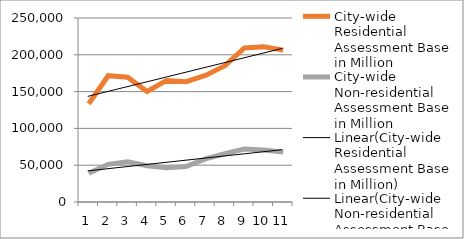
| Category | City-wide Residential Assessment Base in Million | City-wide Non-residential Assessment Base in Million |
|---|---|---|
| 0 | 133549.008 | 38981.991 |
| 1 | 171581.155 | 51165.207 |
| 2 | 169474.953 | 54806.722 |
| 3 | 150124.178 | 49381.907 |
| 4 | 165154.97 | 46634.721 |
| 5 | 163482.266 | 48256.054 |
| 6 | 171968.764 | 58507.068 |
| 7 | 185068.469 | 65529.379 |
| 8 | 209317.419 | 71860.919 |
| 9 | 210885.998 | 70640.58 |
| 10 | 206333.168 | 67765.45 |